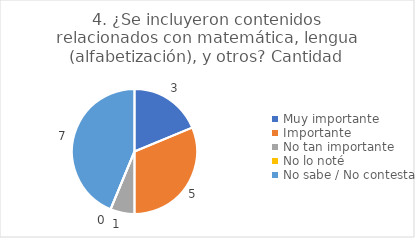
| Category | 4. ¿Se incluyeron contenidos relacionados con matemática, lengua (alfabetización), y otros? |
|---|---|
| Muy importante  | 0.188 |
| Importante  | 0.312 |
| No tan importante  | 0.062 |
| No lo noté  | 0 |
| No sabe / No contesta | 0.438 |